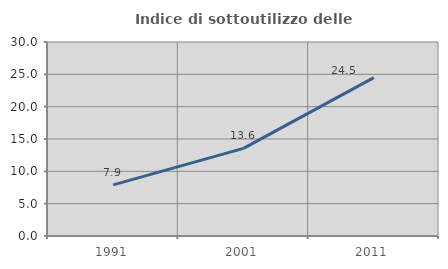
| Category | Indice di sottoutilizzo delle abitazioni  |
|---|---|
| 1991.0 | 7.9 |
| 2001.0 | 13.551 |
| 2011.0 | 24.487 |